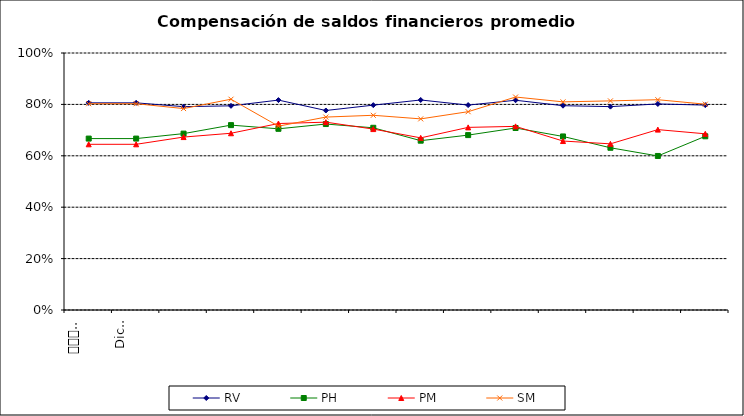
| Category | RV | PH | PM | SM |
|---|---|---|---|---|
| 0 | 0.806 | 0.667 | 0.645 | 0.803 |
| 1 | 0.806 | 0.667 | 0.645 | 0.803 |
| 2 | 0.791 | 0.686 | 0.673 | 0.784 |
| 3 | 0.794 | 0.719 | 0.688 | 0.82 |
| 4 | 0.817 | 0.705 | 0.726 | 0.715 |
| 5 | 0.776 | 0.724 | 0.731 | 0.751 |
| 6 | 0.797 | 0.709 | 0.704 | 0.758 |
| 7 | 0.817 | 0.659 | 0.67 | 0.744 |
| 8 | 0.797 | 0.681 | 0.711 | 0.772 |
| 9 | 0.816 | 0.708 | 0.715 | 0.829 |
| 10 | 0.795 | 0.675 | 0.657 | 0.81 |
| 11 | 0.791 | 0.631 | 0.646 | 0.814 |
| 12 | 0.802 | 0.599 | 0.702 | 0.818 |
| 13 | 0.797 | 0.676 | 0.686 | 0.801 |